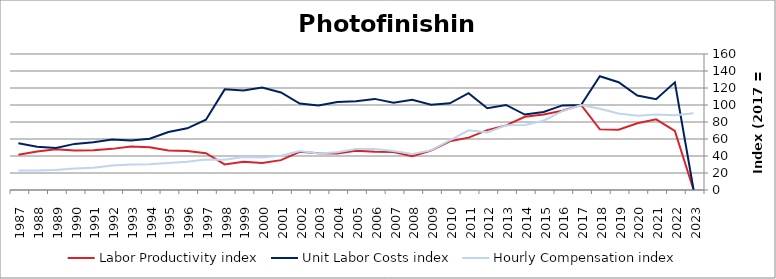
| Category | Labor Productivity index | Unit Labor Costs index | Hourly Compensation index |
|---|---|---|---|
| 2023.0 | 0 | 0 | 90.239 |
| 2022.0 | 69.505 | 126.655 | 88.032 |
| 2021.0 | 83.159 | 106.886 | 88.886 |
| 2020.0 | 78.552 | 111.091 | 87.264 |
| 2019.0 | 70.985 | 126.771 | 89.989 |
| 2018.0 | 71.469 | 133.768 | 95.602 |
| 2017.0 | 100 | 100 | 100 |
| 2016.0 | 93.267 | 99.521 | 92.82 |
| 2015.0 | 88.825 | 91.741 | 81.489 |
| 2014.0 | 86.14 | 88.797 | 76.49 |
| 2013.0 | 76.06 | 100.052 | 76.1 |
| 2012.0 | 70.445 | 96.257 | 67.808 |
| 2011.0 | 61.635 | 114.001 | 70.264 |
| 2010.0 | 57.315 | 101.986 | 58.454 |
| 2009.0 | 46.373 | 100.41 | 46.564 |
| 2008.0 | 39.85 | 106.042 | 42.258 |
| 2007.0 | 44.792 | 102.632 | 45.971 |
| 2006.0 | 45.107 | 107.185 | 48.348 |
| 2005.0 | 46.281 | 104.44 | 48.336 |
| 2004.0 | 42.918 | 103.548 | 44.44 |
| 2003.0 | 43.244 | 99.555 | 43.052 |
| 2002.0 | 45.017 | 101.671 | 45.769 |
| 2001.0 | 35.111 | 114.815 | 40.313 |
| 2000.0 | 31.742 | 120.48 | 38.243 |
| 1999.0 | 33.2 | 116.977 | 38.837 |
| 1998.0 | 30.123 | 118.411 | 35.669 |
| 1997.0 | 43.352 | 82.668 | 35.838 |
| 1996.0 | 45.987 | 72.544 | 33.361 |
| 1995.0 | 46.593 | 68.181 | 31.767 |
| 1994.0 | 50.35 | 60.333 | 30.378 |
| 1993.0 | 51.3 | 58.318 | 29.917 |
| 1992.0 | 48.389 | 59.4 | 28.743 |
| 1991.0 | 46.754 | 56.056 | 26.208 |
| 1990.0 | 46.388 | 54.248 | 25.165 |
| 1989.0 | 47.946 | 49.309 | 23.641 |
| 1988.0 | 45.36 | 50.886 | 23.082 |
| 1987.0 | 41.586 | 54.93 | 22.844 |